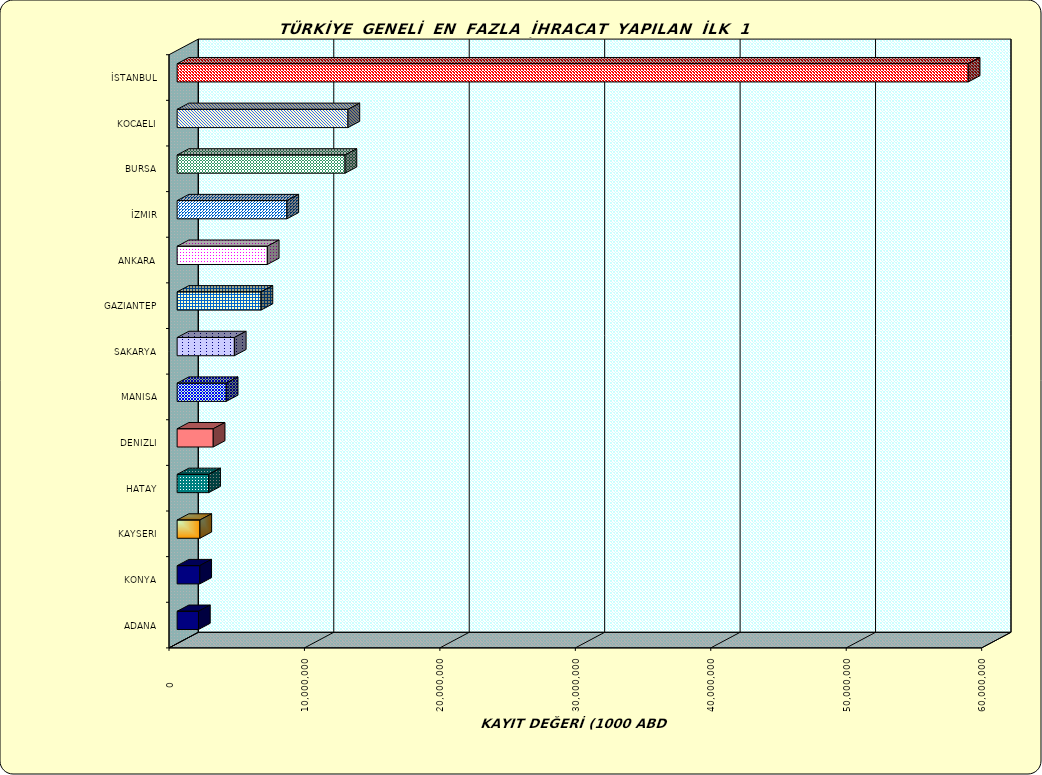
| Category | Series 0 |
|---|---|
| İSTANBUL | 58407243.964 |
| KOCAELI | 12611916.223 |
| BURSA | 12396037.067 |
| İZMIR | 8103944.77 |
| ANKARA | 6660176.637 |
| GAZIANTEP | 6192631.177 |
| SAKARYA | 4226327.236 |
| MANISA | 3625756.833 |
| DENIZLI | 2664523.763 |
| HATAY | 2331263.397 |
| KAYSERI | 1681406.554 |
| KONYA | 1673591.894 |
| ADANA | 1576210.16 |